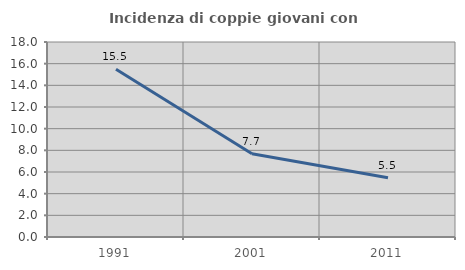
| Category | Incidenza di coppie giovani con figli |
|---|---|
| 1991.0 | 15.476 |
| 2001.0 | 7.692 |
| 2011.0 | 5.462 |